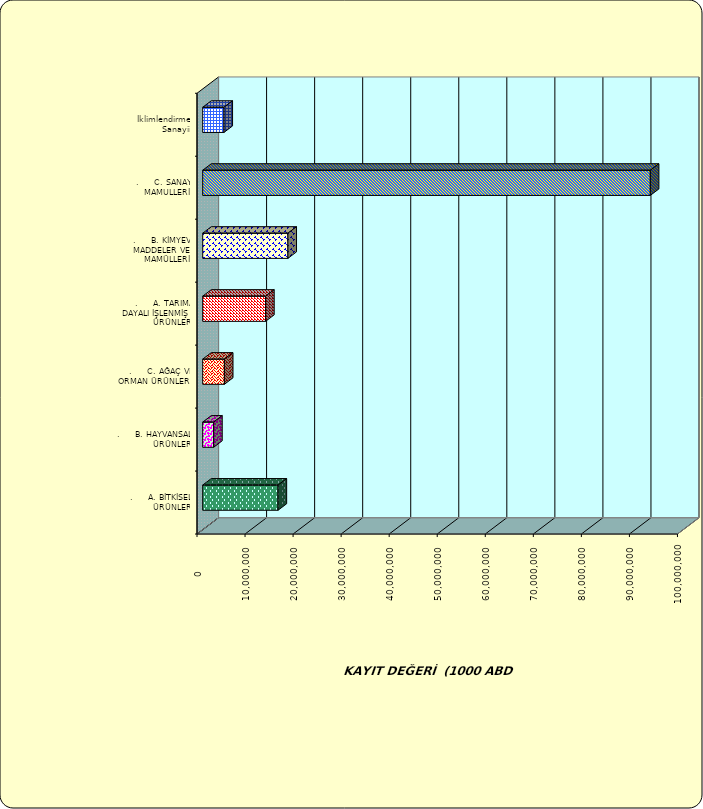
| Category | Series 0 |
|---|---|
| .     A. BİTKİSEL ÜRÜNLER | 15684456.162 |
| .     B. HAYVANSAL ÜRÜNLER | 2274586.826 |
| .     C. AĞAÇ VE ORMAN ÜRÜNLERİ | 4518104.28 |
| .     A. TARIMA DAYALI İŞLENMİŞ ÜRÜNLER | 13092557.13 |
| .     B. KİMYEVİ MADDELER VE MAMÜLLERİ | 17736452.097 |
| .     C. SANAYİ MAMULLERİ | 93162101.674 |
|  İklimlendirme Sanayii | 4422788.666 |